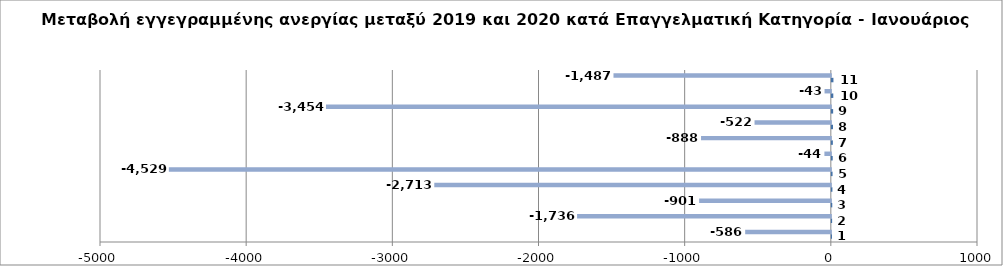
| Category | Series 0 | Series 1 |
|---|---|---|
| 0 | 1 | -586 |
| 1 | 2 | -1736 |
| 2 | 3 | -901 |
| 3 | 4 | -2713 |
| 4 | 5 | -4529 |
| 5 | 6 | -44 |
| 6 | 7 | -888 |
| 7 | 8 | -522 |
| 8 | 9 | -3454 |
| 9 | 10 | -43 |
| 10 | 11 | -1487 |